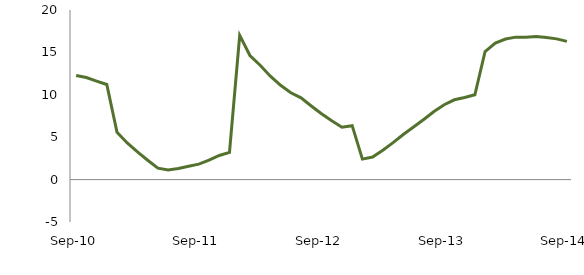
| Category | Series 0 |
|---|---|
| Sep-10 | 12.276 |
|  | 12.041 |
|  | 11.622 |
|  | 11.218 |
|  | 5.573 |
|  | 4.323 |
|  | 3.258 |
|  | 2.281 |
|  | 1.355 |
|  | 1.128 |
|  | 1.308 |
|  | 1.575 |
| Sep-11 | 1.827 |
|  | 2.294 |
|  | 2.841 |
|  | 3.209 |
|  | 17.013 |
|  | 14.631 |
|  | 13.486 |
|  | 12.191 |
|  | 11.116 |
|  | 10.238 |
|  | 9.637 |
|  | 8.68 |
| Sep-12 | 7.761 |
|  | 6.928 |
|  | 6.18 |
|  | 6.362 |
|  | 2.415 |
|  | 2.66 |
|  | 3.457 |
|  | 4.353 |
|  | 5.319 |
|  | 6.197 |
|  | 7.095 |
|  | 8.033 |
| Sep-13 | 8.832 |
|  | 9.413 |
|  | 9.678 |
|  | 10 |
|  | 15.109 |
|  | 16.092 |
|  | 16.574 |
|  | 16.799 |
|  | 16.773 |
|  | 16.874 |
|  | 16.758 |
|  | 16.597 |
| Sep-14 | 16.295 |